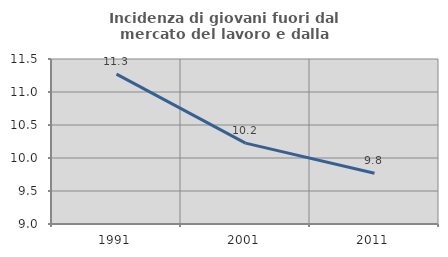
| Category | Incidenza di giovani fuori dal mercato del lavoro e dalla formazione  |
|---|---|
| 1991.0 | 11.271 |
| 2001.0 | 10.225 |
| 2011.0 | 9.769 |